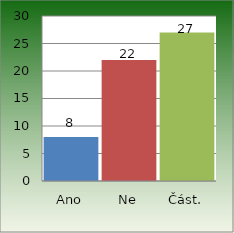
| Category | Series 0 |
|---|---|
| Ano | 8 |
| Ne | 22 |
| Část. | 27 |